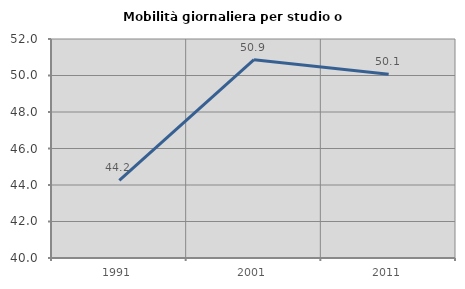
| Category | Mobilità giornaliera per studio o lavoro |
|---|---|
| 1991.0 | 44.248 |
| 2001.0 | 50.867 |
| 2011.0 | 50.066 |